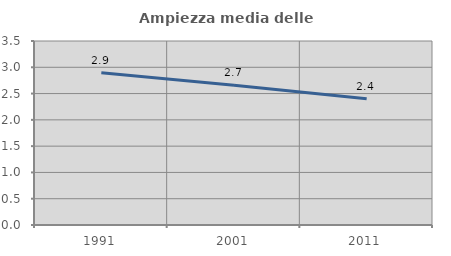
| Category | Ampiezza media delle famiglie |
|---|---|
| 1991.0 | 2.895 |
| 2001.0 | 2.66 |
| 2011.0 | 2.403 |